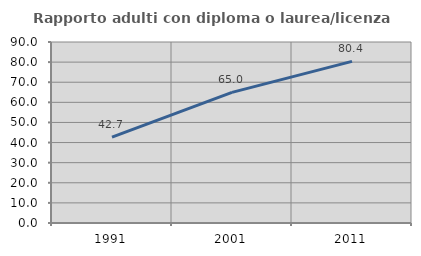
| Category | Rapporto adulti con diploma o laurea/licenza media  |
|---|---|
| 1991.0 | 42.714 |
| 2001.0 | 64.961 |
| 2011.0 | 80.364 |